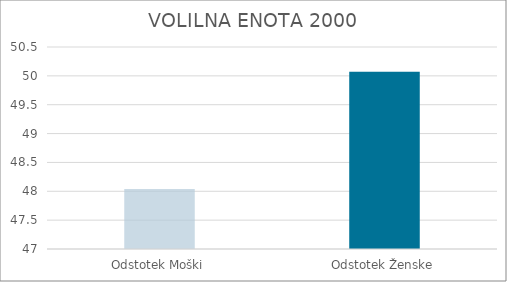
| Category | Series 0 |
|---|---|
| Odstotek Moški | 48.04 |
| Odstotek Ženske | 50.07 |